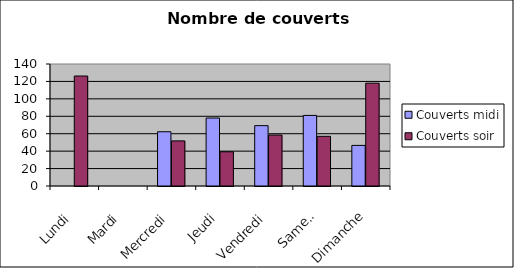
| Category | Couverts |
|---|---|
| Lundi | 126.2 |
| Mardi | 0 |
| Mercredi | 51.75 |
| Jeudi | 39.25 |
| Vendredi | 58.5 |
| Samedi | 57 |
| Dimanche | 118 |